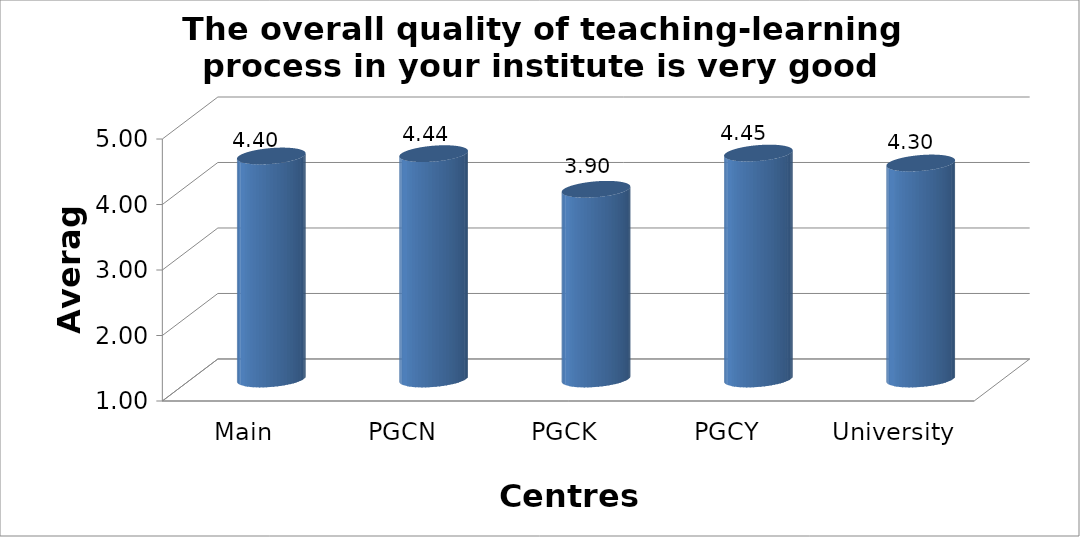
| Category | The overall quality of teaching-learning process in your institute is very good |
|---|---|
| Main Campus | 4.405 |
| PGCN | 4.441 |
| PGCK | 3.897 |
| PGCY | 4.45 |
| University Avg | 4.298 |